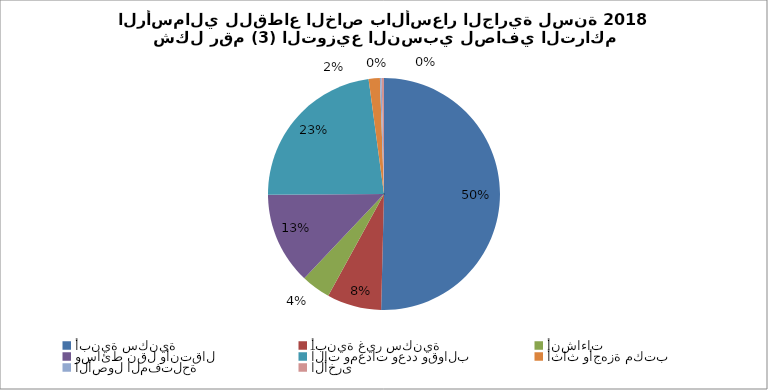
| Category | Series 0 |
|---|---|
| أبنية سكنية | 32830584.383 |
| أبنية غير سكنية | 4942928.296 |
| أنشاءات | 2655606.776 |
| وسائط نقل وأنتقال | 8375207.762 |
| آلات ومعدات وعدد وقوالب | 14959119.987 |
| أثاث وأجهزة مكتب | 1016757.114 |
| الأصول المفتلحة | 155456.961 |
| الأخرى  | 211335.953 |